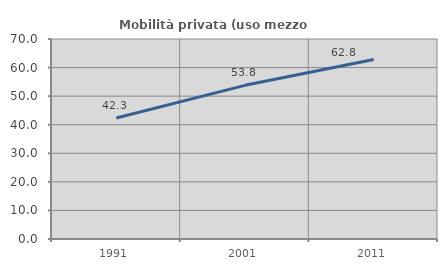
| Category | Mobilità privata (uso mezzo privato) |
|---|---|
| 1991.0 | 42.347 |
| 2001.0 | 53.78 |
| 2011.0 | 62.792 |